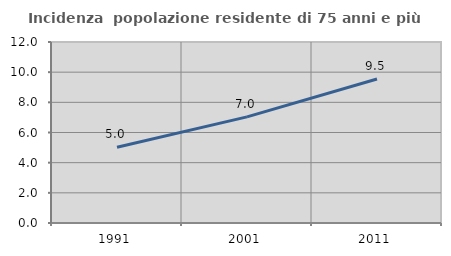
| Category | Incidenza  popolazione residente di 75 anni e più |
|---|---|
| 1991.0 | 5.021 |
| 2001.0 | 7.036 |
| 2011.0 | 9.545 |